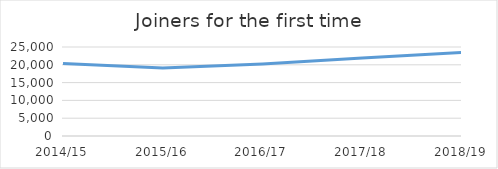
| Category | Joiners for the first time |
|---|---|
| 2014/15 | 20333 |
| 2015/16 | 19114 |
| 2016/17 | 20240 |
| 2017/18 | 21931 |
| 2018/19 | 23498 |